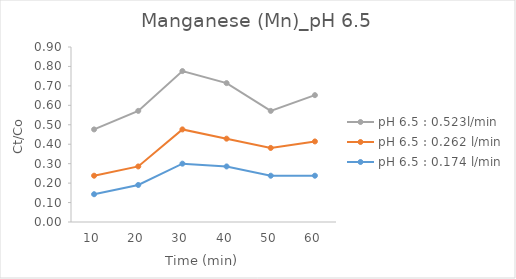
| Category | pH 6.5 : 0.174 l/min | pH 6.5 : 0.262 l/min | pH 6.5 : 0.523l/min |
|---|---|---|---|
| 10.0 | 0.143 | 0.095 | 0.238 |
| 20.0 | 0.19 | 0.095 | 0.286 |
| 30.0 | 0.3 | 0.176 | 0.3 |
| 40.0 | 0.286 | 0.143 | 0.286 |
| 50.0 | 0.238 | 0.143 | 0.19 |
| 60.0 | 0.238 | 0.176 | 0.238 |